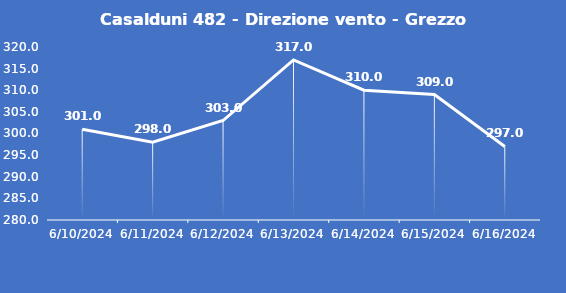
| Category | Casalduni 482 - Direzione vento - Grezzo (°N) |
|---|---|
| 6/10/24 | 301 |
| 6/11/24 | 298 |
| 6/12/24 | 303 |
| 6/13/24 | 317 |
| 6/14/24 | 310 |
| 6/15/24 | 309 |
| 6/16/24 | 297 |